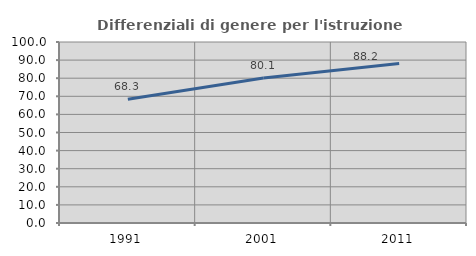
| Category | Differenziali di genere per l'istruzione superiore |
|---|---|
| 1991.0 | 68.318 |
| 2001.0 | 80.13 |
| 2011.0 | 88.179 |